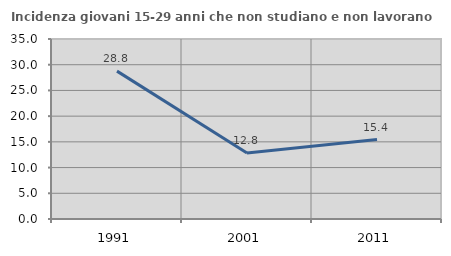
| Category | Incidenza giovani 15-29 anni che non studiano e non lavorano  |
|---|---|
| 1991.0 | 28.75 |
| 2001.0 | 12.821 |
| 2011.0 | 15.441 |